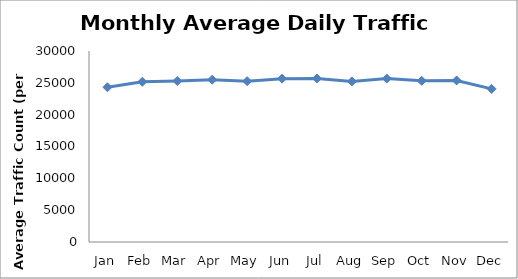
| Category | Series 0 |
|---|---|
| Jan | 24307.75 |
| Feb | 25171.5 |
| Mar | 25286.5 |
| Apr | 25488 |
| May | 25266.25 |
| Jun | 25658.75 |
| Jul | 25686.75 |
| Aug | 25227.5 |
| Sep | 25670.5 |
| Oct | 25321 |
| Nov | 25371.75 |
| Dec | 24055.5 |